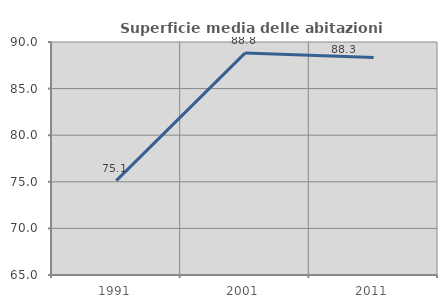
| Category | Superficie media delle abitazioni occupate |
|---|---|
| 1991.0 | 75.121 |
| 2001.0 | 88.809 |
| 2011.0 | 88.331 |